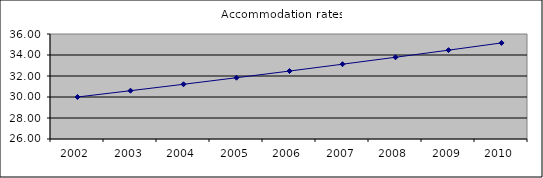
| Category | Accommodation rates |
|---|---|
| 2002.0 | 30 |
| 2003.0 | 30.6 |
| 2004.0 | 31.212 |
| 2005.0 | 31.836 |
| 2006.0 | 32.473 |
| 2007.0 | 33.122 |
| 2008.0 | 33.785 |
| 2009.0 | 34.461 |
| 2010.0 | 35.15 |